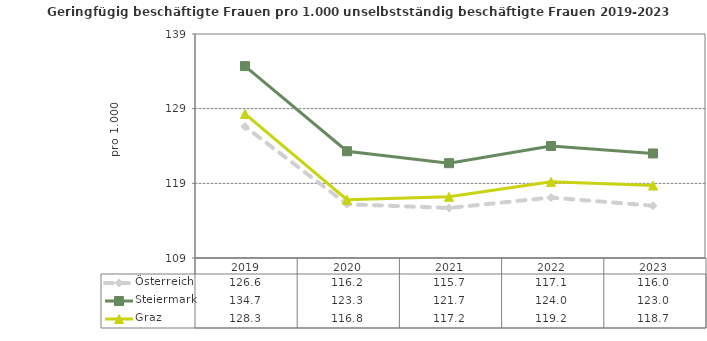
| Category | Österreich | Steiermark | Graz |
|---|---|---|---|
| 2023.0 | 116 | 123 | 118.7 |
| 2022.0 | 117.1 | 124 | 119.2 |
| 2021.0 | 115.7 | 121.7 | 117.2 |
| 2020.0 | 116.2 | 123.3 | 116.8 |
| 2019.0 | 126.6 | 134.7 | 128.3 |